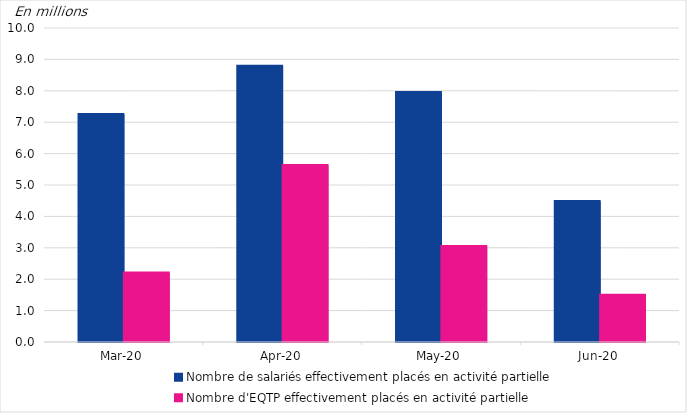
| Category | Nombre de salariés effectivement placés en activité partielle | Nombre d'EQTP effectivement placés en activité partielle |
|---|---|---|
| 2020-03-01 | 7.244 | 2.194 |
| 2020-04-01 | 8.78 | 5.62 |
| 2020-05-01 | 7.947 | 3.041 |
| 2020-06-01 | 4.474 | 1.489 |